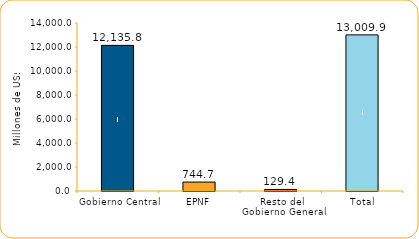
| Category | Series 1 |
|---|---|
| Gobierno Central | 12135.8 |
| EPNF | 744.7 |
| Resto del Gobierno General | 129.4 |
| Total | 13009.9 |